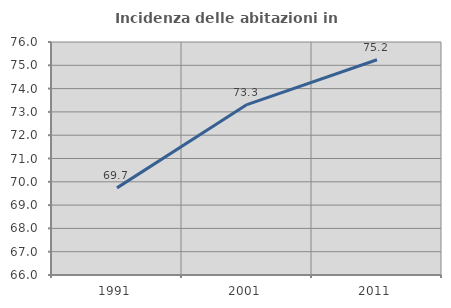
| Category | Incidenza delle abitazioni in proprietà  |
|---|---|
| 1991.0 | 69.739 |
| 2001.0 | 73.313 |
| 2011.0 | 75.239 |